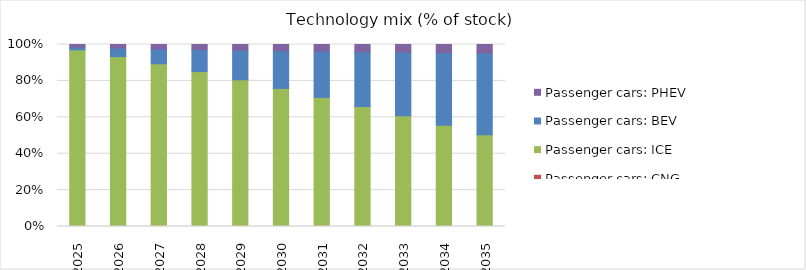
| Category | Passenger cars: CNG | Passenger cars: ICE | Passenger cars: BEV | Passenger cars: PHEV |
|---|---|---|---|---|
| 2025.0 | 0 | 0.97 | 0.015 | 0.014 |
| 2026.0 | 0 | 0.933 | 0.047 | 0.02 |
| 2027.0 | 0 | 0.894 | 0.082 | 0.024 |
| 2028.0 | 0 | 0.851 | 0.121 | 0.028 |
| 2029.0 | 0 | 0.806 | 0.163 | 0.031 |
| 2030.0 | 0 | 0.758 | 0.207 | 0.034 |
| 2031.0 | 0 | 0.709 | 0.254 | 0.037 |
| 2032.0 | 0 | 0.659 | 0.301 | 0.039 |
| 2033.0 | 0 | 0.608 | 0.35 | 0.042 |
| 2034.0 | 0 | 0.556 | 0.4 | 0.044 |
| 2035.0 | 0 | 0.503 | 0.45 | 0.046 |